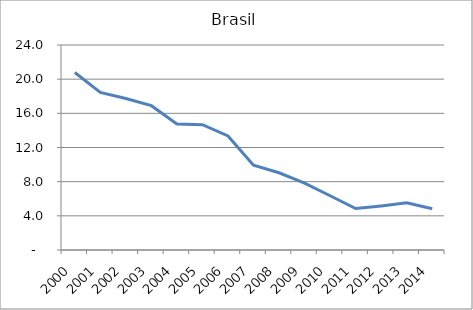
| Category | Brasil |
|---|---|
| 2000.0 | 20.774 |
| 2001.0 | 18.455 |
| 2002.0 | 17.736 |
| 2003.0 | 16.896 |
| 2004.0 | 14.761 |
| 2005.0 | 14.668 |
| 2006.0 | 13.35 |
| 2007.0 | 9.922 |
| 2008.0 | 9.045 |
| 2009.0 | 7.838 |
| 2010.0 | 6.354 |
| 2011.0 | 4.85 |
| 2012.0 | 5.161 |
| 2013.0 | 5.539 |
| 2014.0 | 4.82 |